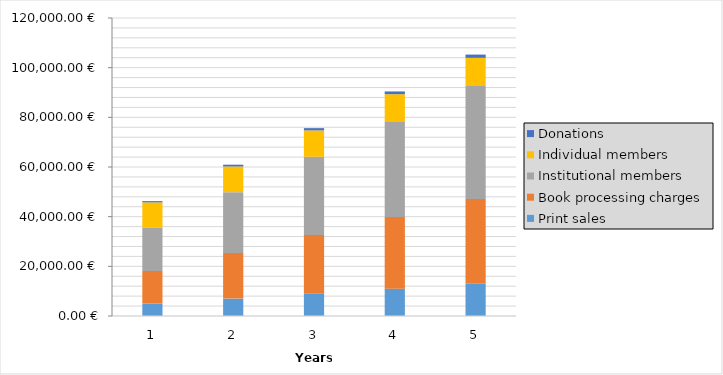
| Category | Print sales | Book processing charges | Institutional members | Individual members | Donations |
|---|---|---|---|---|---|
| 1 | 5000 | 13125 | 17500 | 10140 | 500 |
| 2 | 7000 | 18375 | 24500 | 10350 | 700 |
| 3 | 9000 | 23625 | 31500 | 10620 | 900 |
| 4 | 11000 | 28875 | 38500 | 10950 | 1100 |
| 5 | 13000 | 34125 | 45500 | 11340 | 1300 |